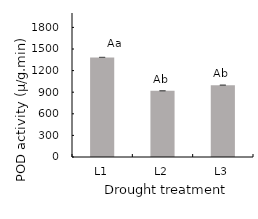
| Category | POD  |
|---|---|
| L1 | 1383.667 |
| L2 | 919.333 |
| L3 | 997.467 |